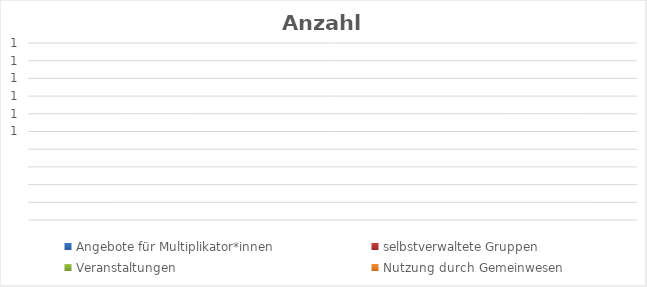
| Category | Angebote für Multiplikator*innen | selbstverwaltete Gruppen | Veranstaltungen | Nutzung durch Gemeinwesen |
|---|---|---|---|---|
| 0 | 0 | 0 | 0 | 0 |